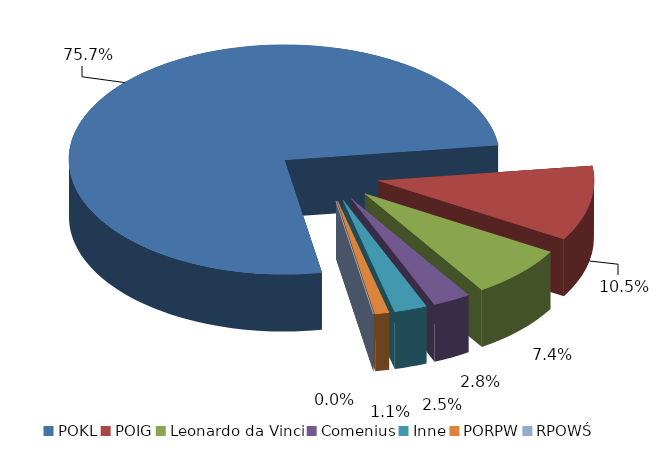
| Category | Series 0 |
|---|---|
| POKL | 7489147.09 |
| POIG | 1043310.65 |
| Leonardo da Vinci | 728299.54 |
| Comenius | 281203.49 |
| Inne | 243591.9 |
| PORPW | 104122.48 |
| RPOWŚ | 0 |